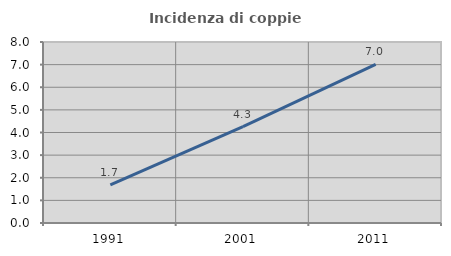
| Category | Incidenza di coppie miste |
|---|---|
| 1991.0 | 1.681 |
| 2001.0 | 4.255 |
| 2011.0 | 7.009 |